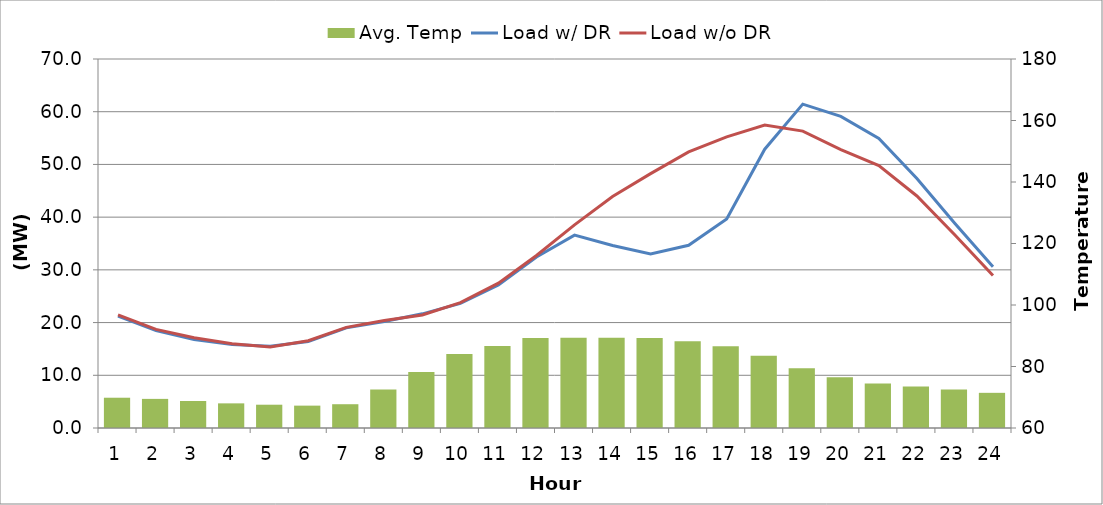
| Category | Avg. Temp |
|---|---|
| 0 | 69.846 |
| 1 | 69.469 |
| 2 | 68.777 |
| 3 | 68.013 |
| 4 | 67.574 |
| 5 | 67.274 |
| 6 | 67.734 |
| 7 | 72.543 |
| 8 | 78.188 |
| 9 | 84.095 |
| 10 | 86.681 |
| 11 | 89.277 |
| 12 | 89.317 |
| 13 | 89.32 |
| 14 | 89.309 |
| 15 | 88.221 |
| 16 | 86.6 |
| 17 | 83.524 |
| 18 | 79.455 |
| 19 | 76.537 |
| 20 | 74.446 |
| 21 | 73.51 |
| 22 | 72.488 |
| 23 | 71.436 |